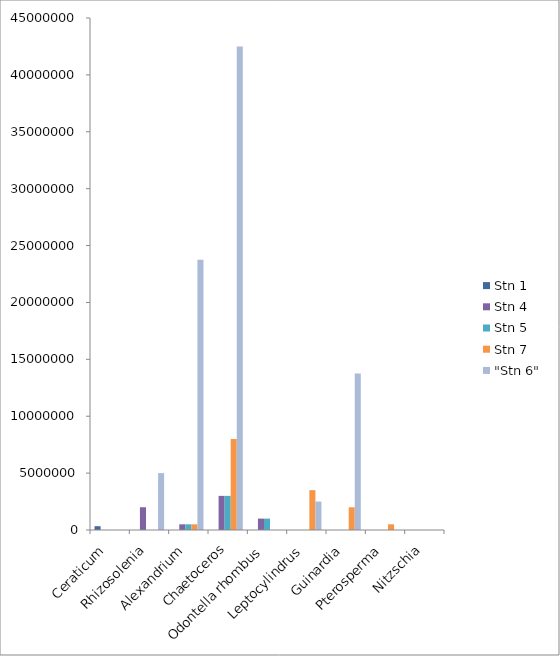
| Category | Stn 1 | Stn 4 | Stn 5 | Stn 7 | "Stn 6" |
|---|---|---|---|---|---|
| Ceraticum | 333333.333 | 0 | 0 | 0 | 0 |
| Rhizosolenia | 0 | 2000000 | 0 | 0 | 5000000 |
| Alexandrium | 0 | 500000 | 500000 | 500000 | 23750000 |
| Chaetoceros | 0 | 3000000 | 3000000 | 8000000 | 42500000 |
| Odontella rhombus | 0 | 1000000 | 1000000 | 0 | 0 |
| Leptocylindrus | 0 | 0 | 0 | 3500000 | 2500000 |
| Guinardia | 0 | 0 | 0 | 2000000 | 13750000 |
| Pterosperma | 0 | 0 | 0 | 500000 | 0 |
| Nitzschia | 0 | 0 | 0 | 0 | 0 |